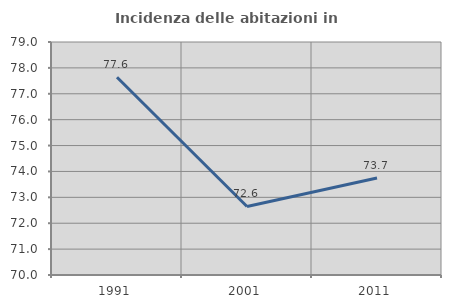
| Category | Incidenza delle abitazioni in proprietà  |
|---|---|
| 1991.0 | 77.637 |
| 2001.0 | 72.647 |
| 2011.0 | 73.744 |